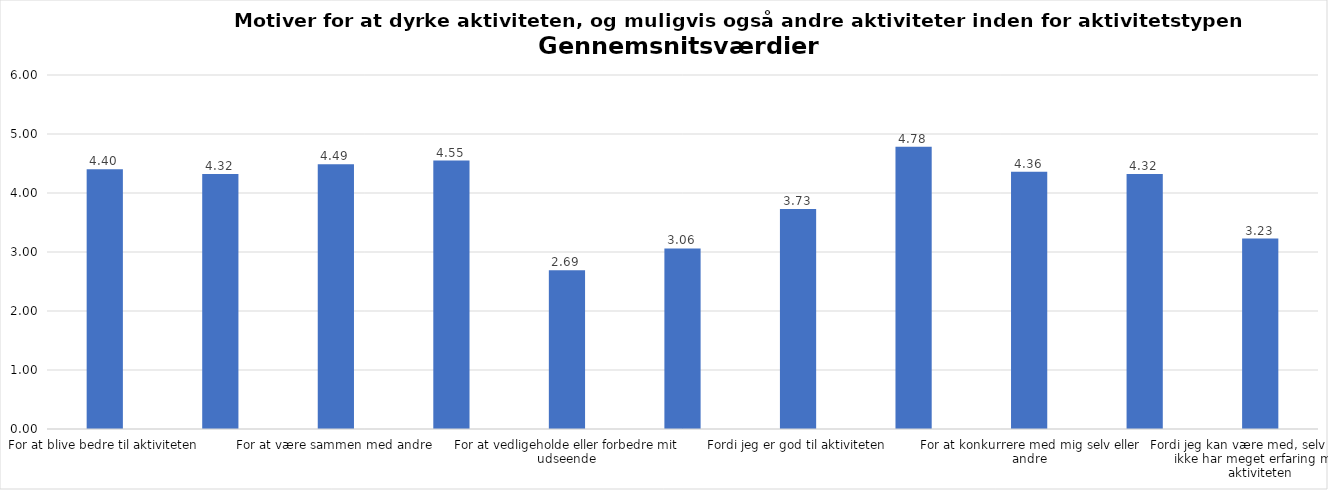
| Category | Gennemsnit |
|---|---|
| For at blive bedre til aktiviteten | 4.404 |
| For at vedligeholde eller forbedre min sundhed (fx helbred, fysisk form) | 4.323 |
| For at være sammen med andre | 4.489 |
| For at gøre noget godt for mig selv | 4.551 |
| For at vedligeholde eller forbedre mit udseende | 2.69 |
| Fordi andre i min omgangskreds opmuntrer mig til det | 3.06 |
| Fordi jeg er god til aktiviteten | 3.727 |
| Fordi jeg godt kan lide aktiviteten | 4.783 |
| For at konkurrere med mig selv eller andre | 4.361 |
| Fordi aktiviteten passer godt ind i min hverdag | 4.32 |
| Fordi jeg kan være med, selv om jeg ikke har meget erfaring med aktiviteten | 3.228 |